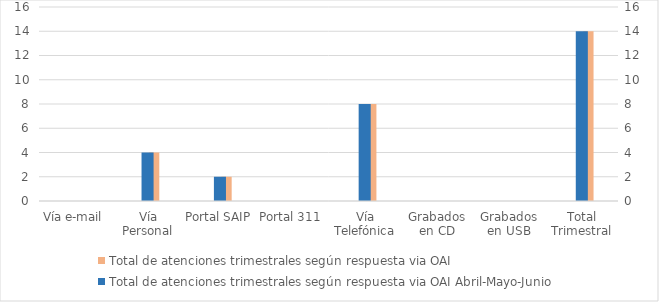
| Category | Total de atenciones trimestrales según respuesta via OAI | Series 2 | Series 4 |
|---|---|---|---|
| Vía e-mail | 0 |  |  |
| Vía Personal | 4 |  |  |
| Portal SAIP | 2 |  |  |
| Portal 311 | 0 |  |  |
| Vía Telefónica | 8 |  |  |
| Grabados en CD | 0 |  |  |
| Grabados en USB | 0 |  |  |
| Total Trimestral | 14 |  |  |